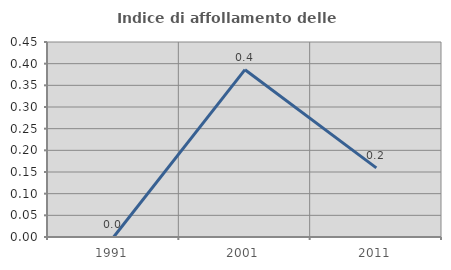
| Category | Indice di affollamento delle abitazioni  |
|---|---|
| 1991.0 | 0 |
| 2001.0 | 0.386 |
| 2011.0 | 0.159 |